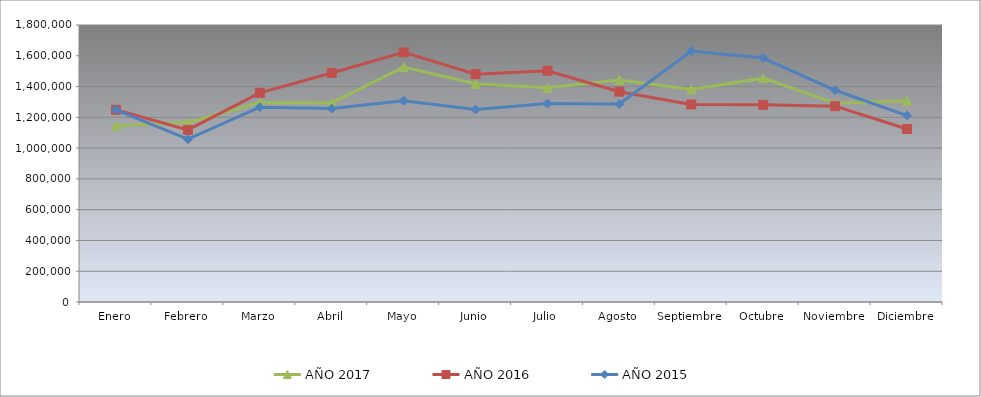
| Category | AÑO 2017 | AÑO 2016 | AÑO 2015 |
|---|---|---|---|
| Enero | 1145160 | 1249660 | 1249111.579 |
| Febrero | 1165730 | 1118420 | 1057754.649 |
| Marzo | 1295890 | 1359040 | 1266201.843 |
| Abril | 1293660 | 1488420 | 1256776.268 |
| Mayo | 1527320 | 1621860 | 1308321.151 |
| Junio | 1417880 | 1480370 | 1250821.197 |
| Julio | 1391720 | 1503020 | 1289450.282 |
| Agosto | 1442240 | 1366700 | 1286295.277 |
| Septiembre | 1381670 | 1283560 | 1630447.096 |
| Octubre | 1454570 | 1281360 | 1585330.534 |
| Noviembre | 1290930 | 1272560 | 1375788.948 |
| Diciembre | 1307280 | 1124160 | 1211620.268 |